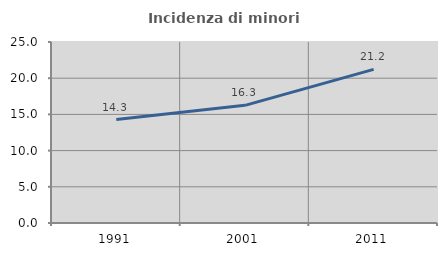
| Category | Incidenza di minori stranieri |
|---|---|
| 1991.0 | 14.286 |
| 2001.0 | 16.25 |
| 2011.0 | 21.212 |